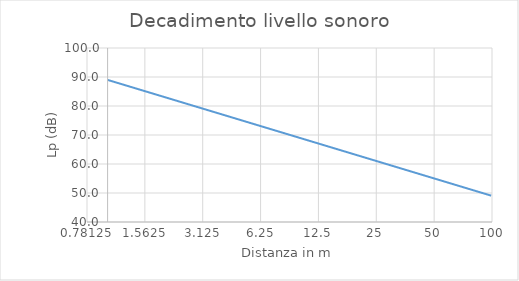
| Category | Series 0 |
|---|---|
| 1.0 | 89 |
| 2.0 | 82.979 |
| 3.0 | 79.458 |
| 4.0 | 76.959 |
| 5.0 | 75.021 |
| 6.0 | 73.437 |
| 7.0 | 72.098 |
| 8.0 | 70.938 |
| 9.0 | 69.915 |
| 10.0 | 69 |
| 11.0 | 68.172 |
| 12.0 | 67.416 |
| 13.0 | 66.721 |
| 14.0 | 66.077 |
| 15.0 | 65.478 |
| 16.0 | 64.918 |
| 17.0 | 64.391 |
| 18.0 | 63.895 |
| 19.0 | 63.425 |
| 20.0 | 62.979 |
| 21.0 | 62.556 |
| 22.0 | 62.152 |
| 23.0 | 61.765 |
| 24.0 | 61.396 |
| 25.0 | 61.041 |
| 26.0 | 60.701 |
| 27.0 | 60.373 |
| 28.0 | 60.057 |
| 29.0 | 59.752 |
| 30.0 | 59.458 |
| 31.0 | 59.173 |
| 32.0 | 58.897 |
| 33.0 | 58.63 |
| 34.0 | 58.37 |
| 35.0 | 58.119 |
| 36.0 | 57.874 |
| 37.0 | 57.636 |
| 38.0 | 57.404 |
| 39.0 | 57.179 |
| 40.0 | 56.959 |
| 41.0 | 56.744 |
| 42.0 | 56.535 |
| 43.0 | 56.331 |
| 44.0 | 56.131 |
| 45.0 | 55.936 |
| 46.0 | 55.745 |
| 47.0 | 55.558 |
| 48.0 | 55.375 |
| 49.0 | 55.196 |
| 50.0 | 55.021 |
| 51.0 | 54.849 |
| 52.0 | 54.68 |
| 53.0 | 54.514 |
| 54.0 | 54.352 |
| 55.0 | 54.193 |
| 56.0 | 54.036 |
| 57.0 | 53.883 |
| 58.0 | 53.731 |
| 59.0 | 53.583 |
| 60.0 | 53.437 |
| 61.0 | 53.293 |
| 62.0 | 53.152 |
| 63.0 | 53.013 |
| 64.0 | 52.876 |
| 65.0 | 52.742 |
| 66.0 | 52.609 |
| 67.0 | 52.479 |
| 68.0 | 52.35 |
| 69.0 | 52.223 |
| 70.0 | 52.098 |
| 71.0 | 51.975 |
| 72.0 | 51.853 |
| 73.0 | 51.734 |
| 74.0 | 51.615 |
| 75.0 | 51.499 |
| 76.0 | 51.384 |
| 77.0 | 51.27 |
| 78.0 | 51.158 |
| 79.0 | 51.047 |
| 80.0 | 50.938 |
| 81.0 | 50.83 |
| 82.0 | 50.724 |
| 83.0 | 50.618 |
| 84.0 | 50.514 |
| 85.0 | 50.412 |
| 86.0 | 50.31 |
| 87.0 | 50.21 |
| 88.0 | 50.11 |
| 89.0 | 50.012 |
| 90.0 | 49.915 |
| 91.0 | 49.819 |
| 92.0 | 49.724 |
| 93.0 | 49.63 |
| 94.0 | 49.537 |
| 95.0 | 49.446 |
| 96.0 | 49.355 |
| 97.0 | 49.265 |
| 98.0 | 49.175 |
| 99.0 | 49.087 |
| 100.0 | 49 |